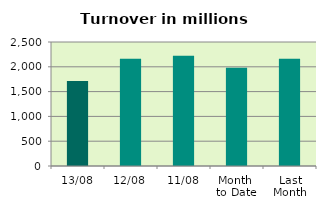
| Category | Series 0 |
|---|---|
| 13/08 | 1712.397 |
| 12/08 | 2160.718 |
| 11/08 | 2221.018 |
| Month 
to Date | 1982.734 |
| Last
Month | 2162.227 |